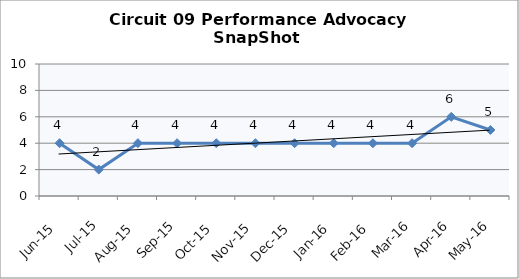
| Category | Circuit 09 |
|---|---|
| Jun-15 | 4 |
| Jul-15 | 2 |
| Aug-15 | 4 |
| Sep-15 | 4 |
| Oct-15 | 4 |
| Nov-15 | 4 |
| Dec-15 | 4 |
| Jan-16 | 4 |
| Feb-16 | 4 |
| Mar-16 | 4 |
| Apr-16 | 6 |
| May-16 | 5 |